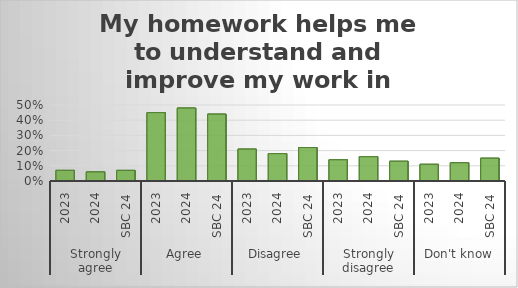
| Category | My homework helps me to understand and improve my work in school. |
|---|---|
| 0 | 0.07 |
| 1 | 0.06 |
| 2 | 0.07 |
| 3 | 0.45 |
| 4 | 0.48 |
| 5 | 0.44 |
| 6 | 0.21 |
| 7 | 0.18 |
| 8 | 0.22 |
| 9 | 0.14 |
| 10 | 0.16 |
| 11 | 0.13 |
| 12 | 0.11 |
| 13 | 0.12 |
| 14 | 0.15 |